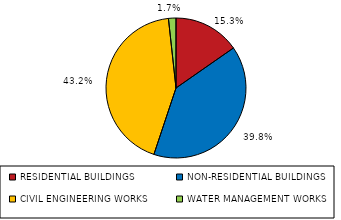
| Category | Series 0 |
|---|---|
| RESIDENTIAL BUILDINGS | 46344 |
| NON-RESIDENTIAL BUILDINGS | 120426 |
| CIVIL ENGINEERING WORKS | 130563 |
| WATER MANAGEMENT WORKS | 5242 |